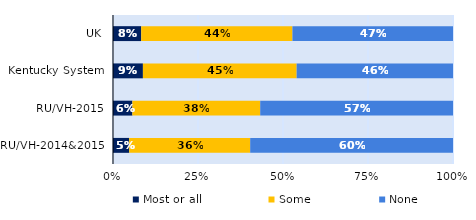
| Category | Most or all | Some | None |
|---|---|---|---|
| UK | 0.083 | 0.445 | 0.472 |
| Kentucky System | 0.088 | 0.452 | 0.46 |
| RU/VH-2015 | 0.057 | 0.376 | 0.567 |
| RU/VH-2014&2015 | 0.048 | 0.356 | 0.596 |